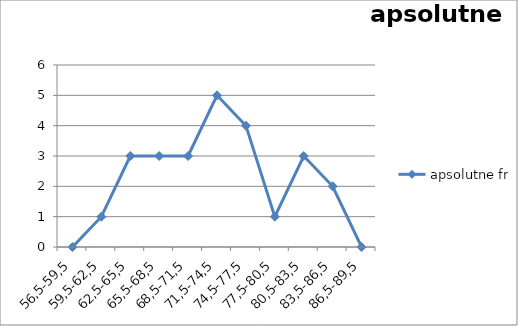
| Category | apsolutne fr. |
|---|---|
| 56,5-59,5 | 0 |
| 59,5-62,5 | 1 |
| 62,5-65,5 | 3 |
| 65,5-68,5 | 3 |
| 68,5-71,5 | 3 |
| 71,5-74,5 | 5 |
| 74,5-77,5 | 4 |
| 77,5-80,5 | 1 |
| 80,5-83,5 | 3 |
| 83,5-86,5 | 2 |
| 86,5-89,5 | 0 |